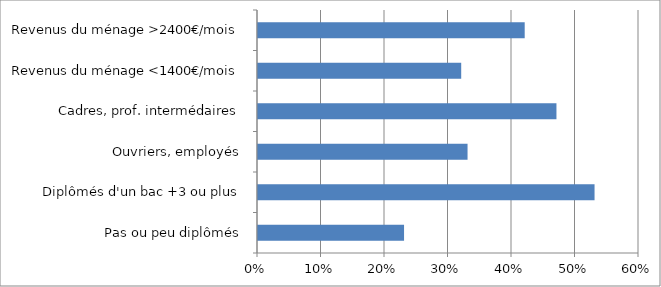
| Category | la CSG contribue exclusivement |
|---|---|
| Pas ou peu diplômés | 0.23 |
| Diplômés d'un bac +3 ou plus | 0.53 |
| Ouvriers, employés | 0.33 |
| Cadres, prof. intermédaires | 0.47 |
| Revenus du ménage <1400€/mois | 0.32 |
| Revenus du ménage >2400€/mois | 0.42 |